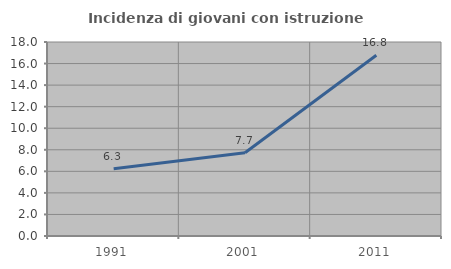
| Category | Incidenza di giovani con istruzione universitaria |
|---|---|
| 1991.0 | 6.25 |
| 2001.0 | 7.719 |
| 2011.0 | 16.774 |